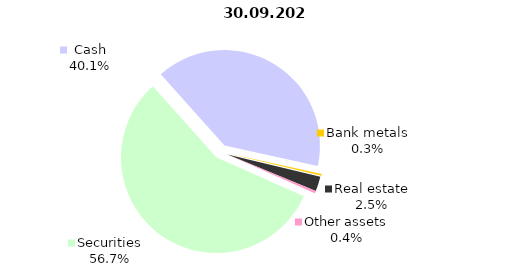
| Category | 30.09.2020 |
|---|---|
| Securities | 1989.58 |
| Cash | 1405.671 |
| Bank metals | 11.037 |
| Real estate | 86.884 |
| Other assets | 15.054 |